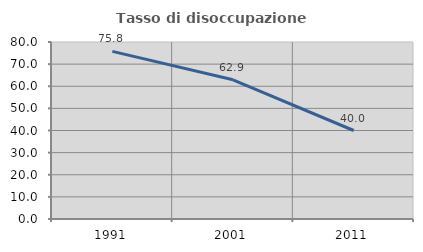
| Category | Tasso di disoccupazione giovanile  |
|---|---|
| 1991.0 | 75.776 |
| 2001.0 | 62.921 |
| 2011.0 | 40 |